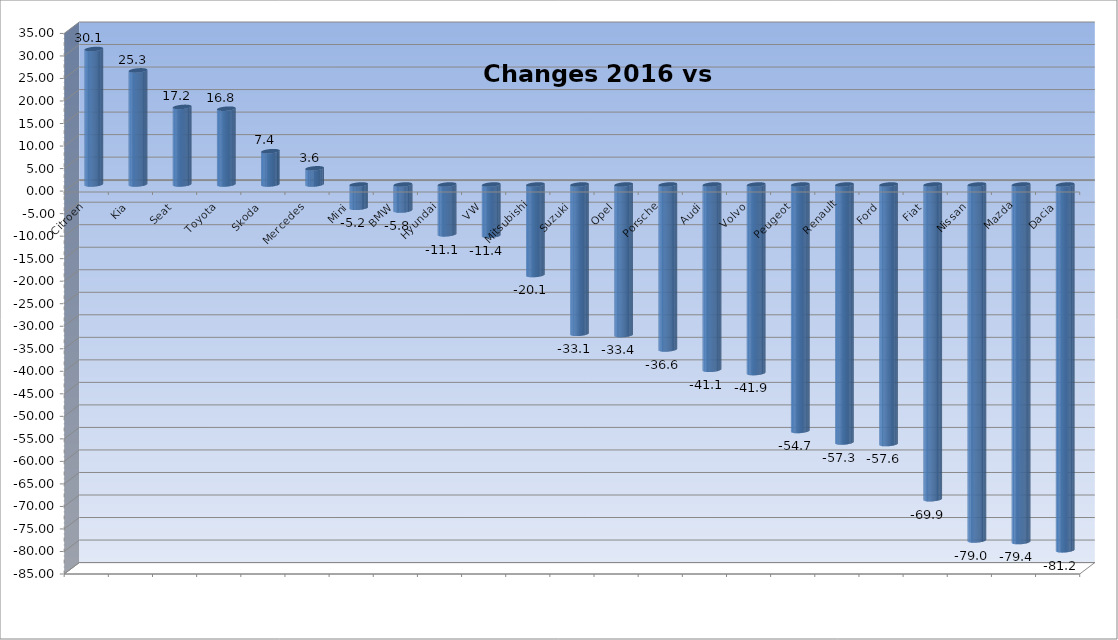
| Category | Ytd 2015 |
|---|---|
| Citroen | 30.075 |
| Kia | 25.331 |
| Seat | 17.226 |
| Toyota | 16.832 |
| Skoda | 7.389 |
| Mercedes | 3.592 |
| Mini | -5.167 |
| BMW | -5.782 |
| Hyundai | -11.07 |
| VW | -11.367 |
| Mitsubishi | -20.098 |
| Suzuki | -33.144 |
| Opel | -33.434 |
| Porsche | -36.62 |
| Audi | -41.139 |
| Volvo | -41.867 |
| Peugeot | -54.715 |
| Renault | -57.277 |
| Ford | -57.625 |
| Fiat | -69.866 |
| Nissan | -79.026 |
| Mazda | -79.37 |
| Dacia | -81.212 |